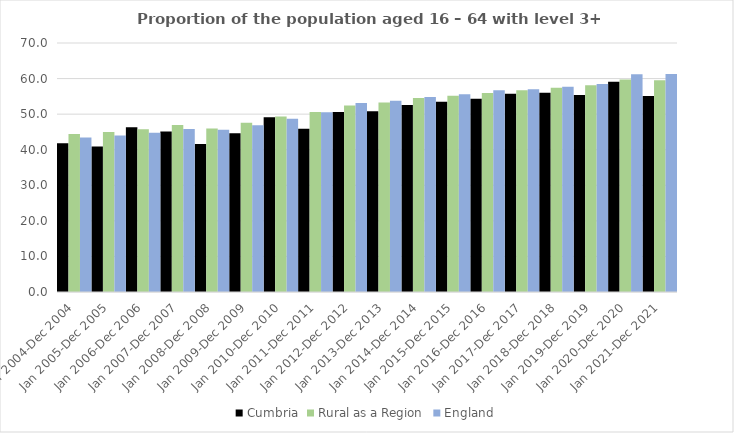
| Category | Cumbria | Rural as a Region | England |
|---|---|---|---|
| Jan 2004-Dec 2004 | 41.8 | 44.405 | 43.4 |
| Jan 2005-Dec 2005 | 40.9 | 44.973 | 44 |
| Jan 2006-Dec 2006 | 46.3 | 45.774 | 44.8 |
| Jan 2007-Dec 2007 | 45.1 | 46.968 | 45.8 |
| Jan 2008-Dec 2008 | 41.6 | 45.964 | 45.6 |
| Jan 2009-Dec 2009 | 44.6 | 47.59 | 46.9 |
| Jan 2010-Dec 2010 | 49.1 | 49.362 | 48.7 |
| Jan 2011-Dec 2011 | 45.9 | 50.602 | 50.5 |
| Jan 2012-Dec 2012 | 50.6 | 52.439 | 53.1 |
| Jan 2013-Dec 2013 | 50.8 | 53.276 | 53.8 |
| Jan 2014-Dec 2014 | 52.6 | 54.57 | 54.8 |
| Jan 2015-Dec 2015 | 53.5 | 55.16 | 55.6 |
| Jan 2016-Dec 2016 | 54.3 | 55.941 | 56.7 |
| Jan 2017-Dec 2017 | 55.7 | 56.689 | 57 |
| Jan 2018-Dec 2018 | 56 | 57.389 | 57.7 |
| Jan 2019-Dec 2019 | 55.4 | 58.147 | 58.5 |
| Jan 2020-Dec 2020 | 59.1 | 59.771 | 61.2 |
| Jan 2021-Dec 2021 | 55.1 | 59.54 | 61.3 |